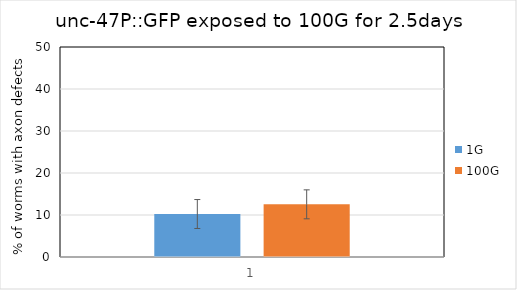
| Category | 1G | 100G |
|---|---|---|
| 0 | 10.235 | 12.542 |